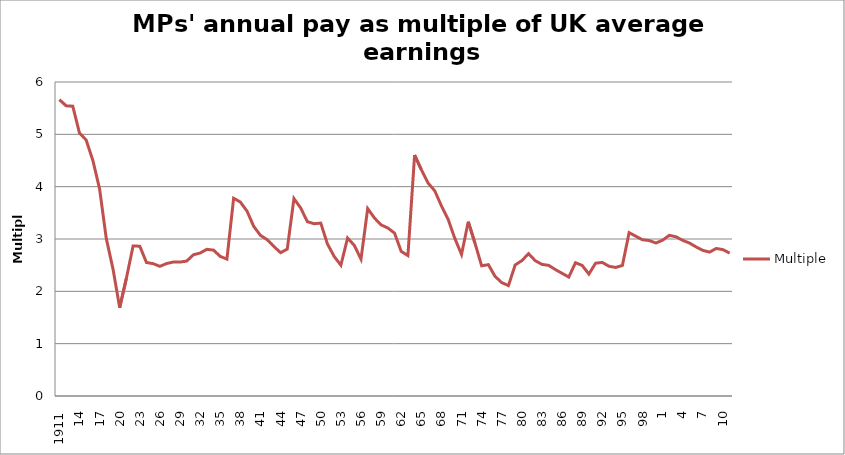
| Category | Multiple |
|---|---|
| 1911.0 | 5.661 |
| 12.0 | 5.547 |
| 13.0 | 5.537 |
| 14.0 | 5.026 |
| 15.0 | 4.891 |
| 16.0 | 4.5 |
| 17.0 | 3.959 |
| 18.0 | 3.011 |
| 19.0 | 2.429 |
| 20.0 | 1.687 |
| 21.0 | 2.249 |
| 22.0 | 2.867 |
| 23.0 | 2.862 |
| 24.0 | 2.551 |
| 25.0 | 2.528 |
| 26.0 | 2.478 |
| 27.0 | 2.531 |
| 28.0 | 2.56 |
| 29.0 | 2.559 |
| 30.0 | 2.579 |
| 31.0 | 2.699 |
| 32.0 | 2.732 |
| 33.0 | 2.803 |
| 34.0 | 2.787 |
| 35.0 | 2.668 |
| 36.0 | 2.616 |
| 37.0 | 3.779 |
| 38.0 | 3.707 |
| 39.0 | 3.532 |
| 40.0 | 3.241 |
| 41.0 | 3.069 |
| 42.0 | 2.988 |
| 43.0 | 2.858 |
| 44.0 | 2.739 |
| 45.0 | 2.807 |
| 46.0 | 3.773 |
| 47.0 | 3.594 |
| 48.0 | 3.331 |
| 49.0 | 3.292 |
| 50.0 | 3.303 |
| 51.0 | 2.904 |
| 52.0 | 2.667 |
| 53.0 | 2.5 |
| 54.0 | 3.019 |
| 55.0 | 2.878 |
| 56.0 | 2.616 |
| 57.0 | 3.581 |
| 58.0 | 3.402 |
| 59.0 | 3.269 |
| 60.0 | 3.211 |
| 61.0 | 3.113 |
| 62.0 | 2.763 |
| 63.0 | 2.683 |
| 64.0 | 4.604 |
| 65.0 | 4.325 |
| 66.0 | 4.071 |
| 67.0 | 3.922 |
| 68.0 | 3.632 |
| 69.0 | 3.377 |
| 70.0 | 3.011 |
| 71.0 | 2.703 |
| 72.0 | 3.331 |
| 73.0 | 2.924 |
| 74.0 | 2.488 |
| 75.0 | 2.51 |
| 76.0 | 2.287 |
| 77.0 | 2.167 |
| 78.0 | 2.11 |
| 79.0 | 2.503 |
| 80.0 | 2.587 |
| 81.0 | 2.72 |
| 82.0 | 2.585 |
| 83.0 | 2.515 |
| 84.0 | 2.496 |
| 85.0 | 2.416 |
| 86.0 | 2.344 |
| 87.0 | 2.273 |
| 88.0 | 2.547 |
| 89.0 | 2.495 |
| 90.0 | 2.33 |
| 91.0 | 2.537 |
| 92.0 | 2.552 |
| 93.0 | 2.479 |
| 94.0 | 2.456 |
| 95.0 | 2.495 |
| 96.0 | 3.121 |
| 97.0 | 3.053 |
| 98.0 | 2.985 |
| 99.0 | 2.97 |
| 2000.0 | 2.924 |
| 1.0 | 2.978 |
| 2.0 | 3.07 |
| 3.0 | 3.042 |
| 4.0 | 2.974 |
| 5.0 | 2.923 |
| 6.0 | 2.848 |
| 7.0 | 2.783 |
| 8.0 | 2.75 |
| 9.0 | 2.819 |
| 10.0 | 2.797 |
| 2011.0 | 2.73 |